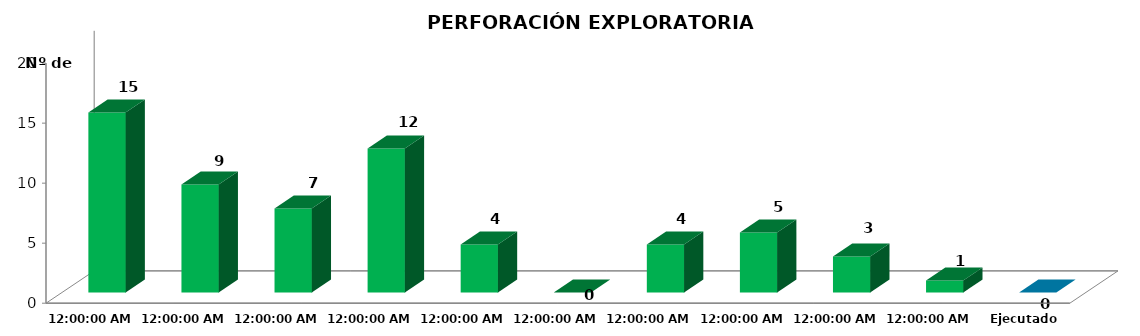
| Category | Series 0 |
|---|---|
| 2011 | 15 |
| 2012 | 9 |
| 2013 | 7 |
| 2014 | 12 |
| 2015 | 4 |
| 2016 | 0 |
| 2017 | 4 |
| 2018 | 5 |
| 2019 | 3 |
| 2020 | 1 |
| Ejecutado 2021 | 0 |